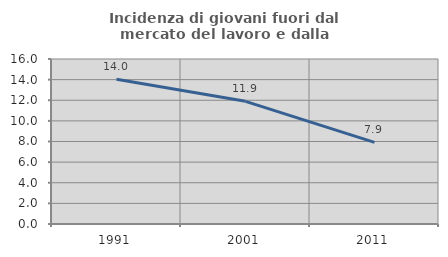
| Category | Incidenza di giovani fuori dal mercato del lavoro e dalla formazione  |
|---|---|
| 1991.0 | 14.031 |
| 2001.0 | 11.897 |
| 2011.0 | 7.914 |